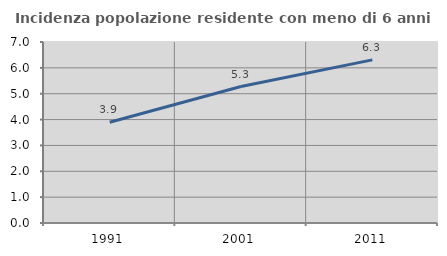
| Category | Incidenza popolazione residente con meno di 6 anni |
|---|---|
| 1991.0 | 3.894 |
| 2001.0 | 5.278 |
| 2011.0 | 6.31 |